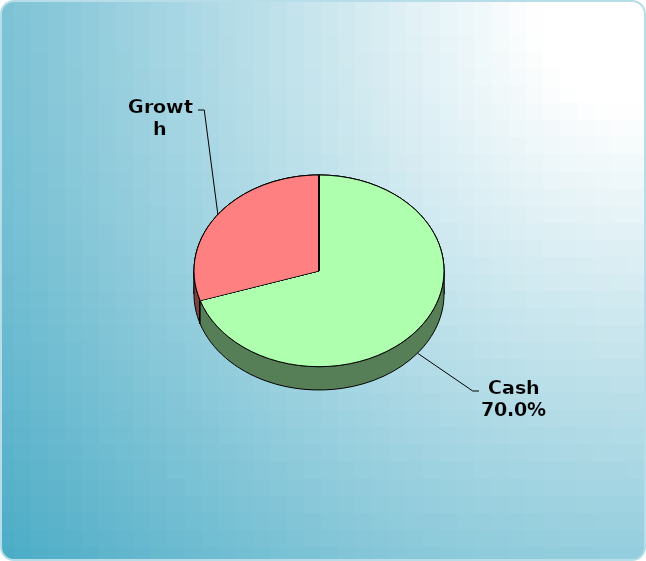
| Category | Series 0 |
|---|---|
| Cash | 350000 |
| Bonds | 0 |
| Muni Bond | 0 |
| Hybrid bond | 0 |
| Value | 0 |
| Growth | 150000 |
| Small-Cap | 0 |
| Tangibles | 0 |
| International | 0 |
| Personal Property | 0 |
| Miscellaneous | 0 |